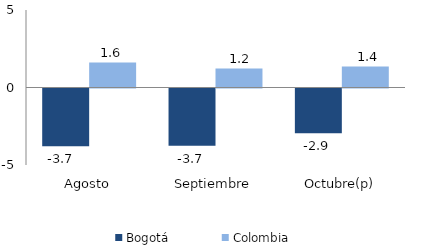
| Category | Bogotá | Colombia |
|---|---|---|
| Agosto | -3.723 | 1.62 |
| Septiembre | -3.695 | 1.232 |
| Octubre(p) | -2.88 | 1.361 |